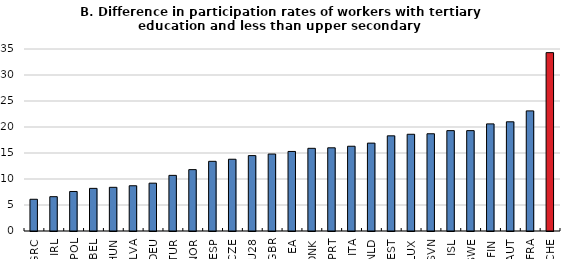
| Category | Difference |
|---|---|
| GRC | 6.1 |
| IRL | 6.6 |
| POL | 7.6 |
| BEL | 8.2 |
| HUN | 8.4 |
| LVA | 8.7 |
| DEU | 9.2 |
| TUR | 10.7 |
| NOR | 11.8 |
| ESP | 13.4 |
| CZE | 13.8 |
| EU28 | 14.5 |
| GBR | 14.8 |
| EA | 15.3 |
| DNK | 15.9 |
| PRT | 16 |
| ITA | 16.3 |
| NLD | 16.9 |
| EST | 18.3 |
| LUX | 18.6 |
| SVN | 18.7 |
| ISL | 19.3 |
| SWE | 19.3 |
| FIN | 20.6 |
| AUT | 21 |
| FRA | 23.1 |
| CHE | 34.3 |